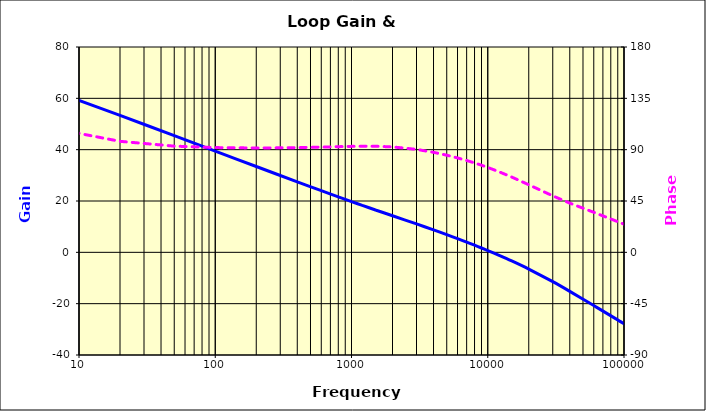
| Category | Gain |
|---|---|
| 1.0 | 70.731 |
| 2.0 | 69.261 |
| 5.0 | 64.474 |
| 10.0 | 59.178 |
| 20.0 | 53.359 |
| 50.0 | 45.459 |
| 100.0 | 39.45 |
| 200.0 | 33.443 |
| 400.0 | 27.467 |
| 600.0 | 24.014 |
| 800.0 | 21.603 |
| 1000.0 | 19.765 |
| 1200.0 | 18.287 |
| 1500.0 | 16.509 |
| 2000.0 | 14.253 |
| 3000.0 | 11.074 |
| 4000.0 | 8.756 |
| 5000.0 | 6.899 |
| 6000.0 | 5.337 |
| 7000.0 | 3.981 |
| 8000.0 | 2.778 |
| 9000.0 | 1.692 |
| 10000.0 | 0.699 |
| 12000.0 | -1.075 |
| 15000.0 | -3.356 |
| 20000.0 | -6.516 |
| 30000.0 | -11.431 |
| 40000.0 | -15.206 |
| 60000.0 | -20.746 |
| 100000.0 | -27.838 |
| 200000.0 | -38.021 |